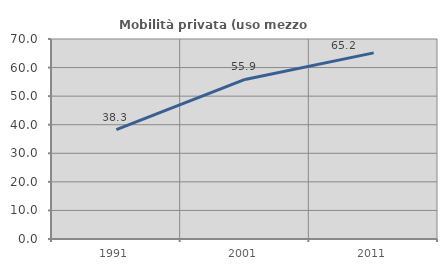
| Category | Mobilità privata (uso mezzo privato) |
|---|---|
| 1991.0 | 38.267 |
| 2001.0 | 55.854 |
| 2011.0 | 65.154 |